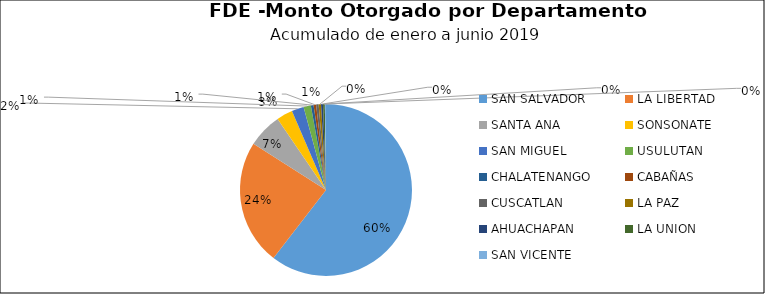
| Category | Monto | Créditos |
|---|---|---|
| SAN SALVADOR | 3.935 | 59 |
| LA LIBERTAD | 1.534 | 29 |
| SANTA ANA | 0.421 | 7 |
| SONSONATE | 0.197 | 7 |
| SAN MIGUEL | 0.149 | 6 |
| USULUTAN | 0.089 | 7 |
| CHALATENANGO | 0.034 | 4 |
| CABAÑAS | 0.031 | 2 |
| CUSCATLAN | 0.03 | 4 |
| LA PAZ | 0.029 | 4 |
| AHUACHAPAN | 0.024 | 3 |
| LA UNION | 0.022 | 3 |
| SAN VICENTE | 0.014 | 1 |